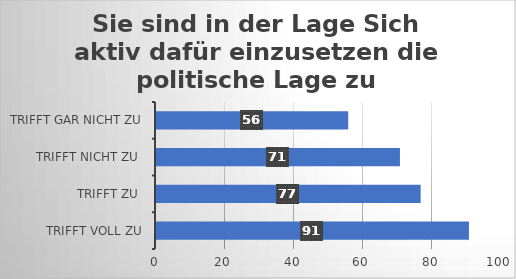
| Category | Sie sind in der Lage Sich aktiv dafür einzusetzen die politische Lage zu verbessern. |
|---|---|
| trifft voll zu | 91 |
| trifft zu  | 77 |
| trifft nicht zu  | 71 |
| trifft gar nicht zu | 56 |